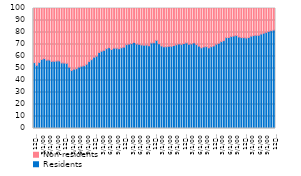
| Category | Residents | Non-residents  |
|---|---|---|
| 12
2013 | 54.939 | 45.061 |
| 1 | 52.632 | 47.368 |
| 2 | 55.024 | 44.976 |
| 3 | 57.529 | 42.471 |
| 4 | 58.275 | 41.725 |
| 5 | 56.994 | 43.006 |
| 6 | 57.079 | 42.921 |
| 7 | 55.908 | 44.092 |
| 8 | 55.99 | 44.01 |
| 9 | 56.259 | 43.741 |
| 10 | 56.316 | 43.684 |
| 11 | 54.626 | 45.374 |
| 12
2014 | 54.518 | 45.482 |
| 1 | 54.275 | 45.725 |
| 2 | 51.149 | 48.851 |
| 3 | 48.387 | 51.613 |
| 4 | 49.394 | 50.606 |
| 5 | 49.863 | 50.137 |
| 6 | 51.173 | 48.827 |
| 7 | 51.916 | 48.084 |
| 8 | 52.313 | 47.687 |
| 9 | 53.486 | 46.514 |
| 10 | 55.78 | 44.22 |
| 11 | 57.361 | 42.639 |
| 12
2015 | 59.38 | 40.62 |
| 1 | 60.252 | 39.748 |
| 2 | 63.321 | 36.679 |
| 3 | 64.419 | 35.581 |
| 4 | 65.102 | 34.898 |
| 5 | 66.515 | 33.485 |
| 6 | 67.33 | 32.67 |
| 7 | 65.846 | 34.154 |
| 8 | 66.966 | 33.034 |
| 9 | 66.935 | 33.065 |
| 10 | 66.482 | 33.518 |
| 11 | 67.293 | 32.707 |
| 12
2016 | 67.823 | 32.177 |
| 1 | 69.888 | 30.112 |
| 2 | 70.36 | 29.64 |
| 3 | 70.739 | 29.261 |
| 4 | 71.751 | 28.249 |
| 5 | 70.41 | 29.59 |
| 6 | 70.279 | 29.721 |
| 7 | 69.666 | 30.334 |
| 8 | 69.318 | 30.682 |
| 9 | 69.544 | 30.456 |
| 10 | 68.976 | 31.024 |
| 11 | 71.255 | 28.745 |
| 12
2017 | 71.404 | 28.596 |
| 1 | 73.407 | 26.593 |
| 2 | 70.601 | 29.399 |
| 3 | 68.779 | 31.221 |
| 4 | 68.22 | 31.78 |
| 5 | 68.185 | 31.815 |
| 6 | 68.639 | 31.361 |
| 7 | 68.533 | 31.467 |
| 8 | 69.133 | 30.867 |
| 9 | 69.84 | 30.16 |
| 10 | 70.47 | 29.53 |
| 11 | 70.173 | 29.827 |
| 12
2018 | 70.775 | 29.225 |
| 1 | 71.357 | 28.643 |
| 2 | 70.234 | 29.766 |
| 3 | 70.548 | 29.452 |
| 4 | 71.349 | 28.651 |
| 5 | 69.929 | 30.071 |
| 6 | 68.659 | 31.341 |
| 7 | 67.282 | 32.718 |
| 8 | 68.026 | 31.974 |
| 9 | 68.252 | 31.748 |
| 10 | 67.245 | 32.755 |
| 11 | 68.232 | 31.768 |
| 12
2019 | 68.829 | 31.171 |
| 1 | 70.218 | 29.782 |
| 2 | 71.009 | 28.991 |
| 3 | 72.419 | 27.581 |
| 4 | 73.241 | 26.759 |
| 5 | 75.701 | 24.299 |
| 6 | 75.824 | 24.176 |
| 7 | 76.71 | 23.29 |
| 8 | 77.105 | 22.895 |
| 9 | 77.53 | 22.47 |
| 10 | 76.286 | 23.714 |
| 11 | 75.796 | 24.204 |
| 12
2020 | 75.693 | 24.307 |
| 1 | 75.438 | 24.562 |
| 2 | 75.836 | 24.164 |
| 3 | 76.967 | 23.033 |
| 4 | 77.45 | 22.55 |
| 5 | 77.673 | 22.327 |
| 6 | 77.7 | 22.3 |
| 7 | 78.754 | 21.246 |
| 8 | 79.408 | 20.592 |
| 9 | 80.097 | 19.903 |
| 10 | 80.932 | 19.068 |
| 11 | 81.54 | 18.46 |
| 12
2021 | 82.041 | 17.959 |